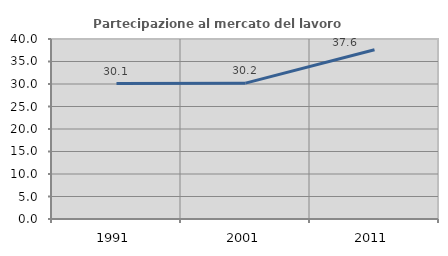
| Category | Partecipazione al mercato del lavoro  femminile |
|---|---|
| 1991.0 | 30.097 |
| 2001.0 | 30.189 |
| 2011.0 | 37.619 |